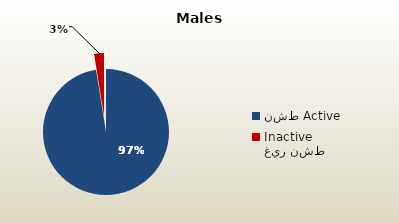
| Category | الذكور غير القطريين  Non-Qatari Males |
|---|---|
| نشط Active | 1708501 |
| غير نشط Inactive | 44285 |